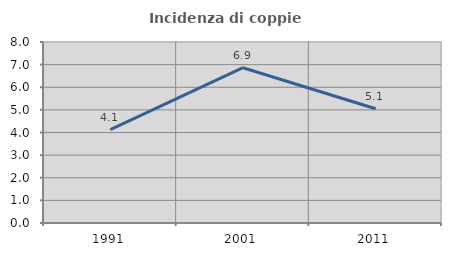
| Category | Incidenza di coppie miste |
|---|---|
| 1991.0 | 4.124 |
| 2001.0 | 6.863 |
| 2011.0 | 5.051 |